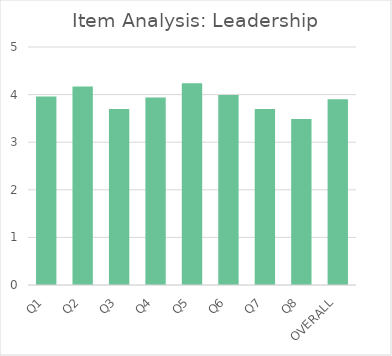
| Category | Series 0 |
|---|---|
| Q1 | 3.96 |
| Q2 | 4.17 |
| Q3 | 3.7 |
| Q4 | 3.94 |
| Q5 | 4.24 |
| Q6 | 3.99 |
| Q7 | 3.7 |
| Q8 | 3.49 |
| OVERALL | 3.9 |